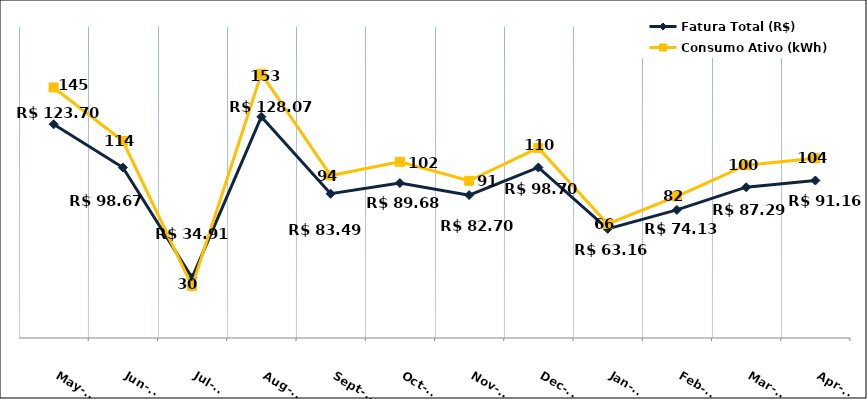
| Category | Fatura Total (R$) |
|---|---|
| 2023-05-01 | 123.7 |
| 2023-06-01 | 98.67 |
| 2023-07-01 | 34.91 |
| 2023-08-01 | 128.07 |
| 2023-09-01 | 83.49 |
| 2023-10-01 | 89.68 |
| 2023-11-01 | 82.7 |
| 2023-12-01 | 98.7 |
| 2024-01-01 | 63.16 |
| 2024-02-01 | 74.13 |
| 2024-03-01 | 87.29 |
| 2024-04-01 | 91.16 |